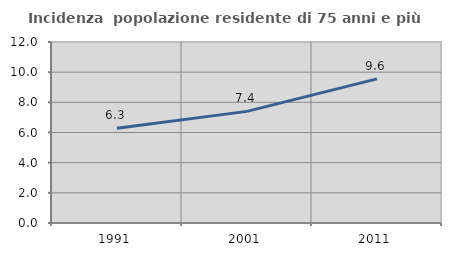
| Category | Incidenza  popolazione residente di 75 anni e più |
|---|---|
| 1991.0 | 6.288 |
| 2001.0 | 7.4 |
| 2011.0 | 9.556 |